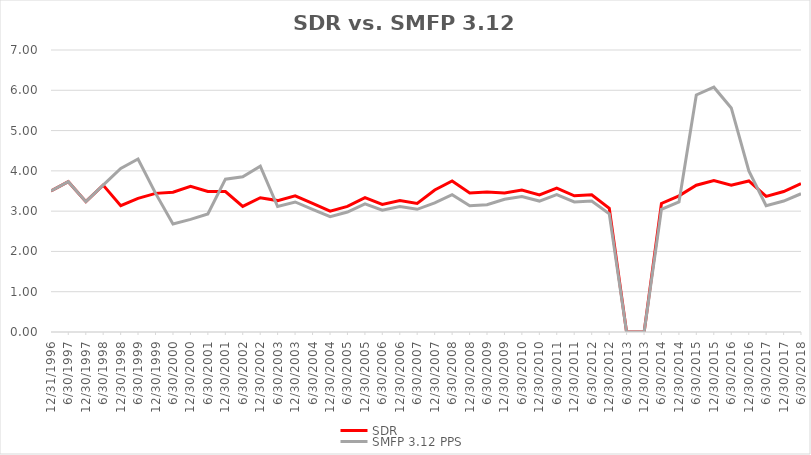
| Category | SDR | SMFP 3.12 PPS |
|---|---|---|
| 12/31/96 | 3.5 | 3.5 |
| 6/30/97 | 3.731 | 3.731 |
| 12/31/97 | 3.235 | 3.235 |
| 6/30/98 | 3.647 | 3.647 |
| 12/31/98 | 3.136 | 4.059 |
| 6/30/99 | 3.318 | 4.294 |
| 12/31/99 | 3.441 | 3.441 |
| 6/30/00 | 3.471 | 2.682 |
| 12/31/00 | 3.618 | 2.795 |
| 6/30/01 | 3.486 | 2.932 |
| 12/31/01 | 3.486 | 3.794 |
| 6/30/02 | 3.119 | 3.853 |
| 12/31/02 | 3.333 | 4.118 |
| 6/30/03 | 3.262 | 3.114 |
| 12/31/03 | 3.381 | 3.227 |
| 6/30/04 | 3.19 | 3.045 |
| 12/31/04 | 3 | 2.864 |
| 6/30/05 | 3.119 | 2.977 |
| 12/31/05 | 3.333 | 3.182 |
| 6/30/06 | 3.167 | 3.023 |
| 12/31/06 | 3.262 | 3.114 |
| 6/30/07 | 3.19 | 3.045 |
| 12/31/07 | 3.525 | 3.205 |
| 6/30/08 | 3.75 | 3.409 |
| 12/31/08 | 3.45 | 3.136 |
| 6/30/09 | 3.475 | 3.159 |
| 12/31/09 | 3.452 | 3.295 |
| 6/30/10 | 3.524 | 3.364 |
| 12/31/10 | 3.405 | 3.25 |
| 6/30/11 | 3.571 | 3.409 |
| 12/31/11 | 3.381 | 3.227 |
| 6/30/12 | 3.405 | 3.25 |
| 12/31/12 | 3.071 | 2.932 |
| 6/30/13 | 0 | 0 |
| 12/31/13 | 0 | 0 |
| 6/30/14 | 3.19 | 3.045 |
| 12/31/14 | 3.381 | 3.227 |
| 6/30/15 | 3.643 | 5.885 |
| 12/31/15 | 3.762 | 6.077 |
| 6/30/16 | 3.643 | 5.561 |
| 12/31/16 | 3.75 | 3.999 |
| 6/30/17 | 3.366 | 3.136 |
| 12/31/17 | 3.488 | 3.25 |
| 6/30/18 | 3.683 | 3.432 |